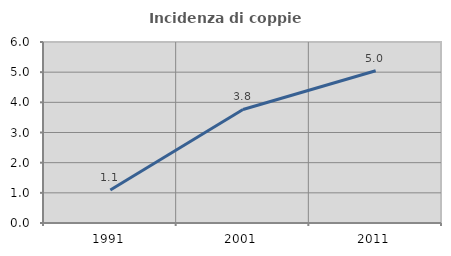
| Category | Incidenza di coppie miste |
|---|---|
| 1991.0 | 1.096 |
| 2001.0 | 3.763 |
| 2011.0 | 5.049 |